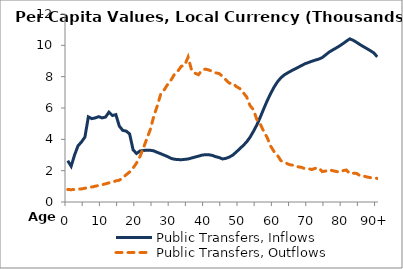
| Category | Public Transfers, Inflows | Public Transfers, Outflows |
|---|---|---|
| 0 | 2636.435 | 796.251 |
|  | 2284.681 | 786.875 |
| 2 | 3008.656 | 799.145 |
| 3 | 3586.263 | 822.263 |
| 4 | 3832.16 | 836.266 |
| 5 | 4143.396 | 877.52 |
| 6 | 5435.272 | 923.747 |
| 7 | 5319.675 | 956.469 |
| 8 | 5367.336 | 1007.529 |
| 9 | 5446.616 | 1054.771 |
| 10 | 5368.425 | 1102.992 |
| 11 | 5422.784 | 1159.778 |
| 12 | 5736.577 | 1221.999 |
| 13 | 5517.777 | 1247.824 |
| 14 | 5577.428 | 1351.046 |
| 15 | 4842.377 | 1390.139 |
| 16 | 4571.552 | 1540.392 |
| 17 | 4525.901 | 1742.083 |
| 18 | 4343.983 | 1917.561 |
| 19 | 3334.344 | 2163.416 |
| 20 | 3094.694 | 2484.869 |
| 21 | 3255.503 | 2902.279 |
| 22 | 3287.121 | 3438.508 |
| 23 | 3310.447 | 4039.507 |
| 24 | 3301.396 | 4621.226 |
| 25 | 3264.789 | 5449.483 |
| 26 | 3169.648 | 6109.37 |
| 27 | 3086.85 | 6857.86 |
| 28 | 2992.792 | 7142.355 |
| 29 | 2904.205 | 7487.77 |
| 30 | 2787.278 | 7776.812 |
| 31 | 2729.9 | 8141.392 |
| 32 | 2709.501 | 8349.759 |
| 33 | 2696.916 | 8658.719 |
| 34 | 2721.718 | 8721.332 |
| 35 | 2744.48 | 9250.804 |
| 36 | 2808.322 | 8428.557 |
| 37 | 2867.524 | 8222.343 |
| 38 | 2924.779 | 8126.729 |
| 39 | 2990.831 | 8403.261 |
| 40 | 3018.134 | 8483.289 |
| 41 | 3015.707 | 8429.567 |
| 42 | 2978.705 | 8335.41 |
| 43 | 2893.491 | 8245.374 |
| 44 | 2840.445 | 8200.298 |
| 45 | 2747.044 | 8021.436 |
| 46 | 2785.606 | 7791.646 |
| 47 | 2869.583 | 7582.022 |
| 48 | 2996.125 | 7588.489 |
| 49 | 3189.312 | 7369.102 |
| 50 | 3393.825 | 7249.431 |
| 51 | 3602.716 | 6987.068 |
| 52 | 3830.332 | 6716.766 |
| 53 | 4131.761 | 6155.45 |
| 54 | 4509.342 | 5885.76 |
| 55 | 4927.816 | 5254.392 |
| 56 | 5423.126 | 4972.79 |
| 57 | 5954.602 | 4489.583 |
| 58 | 6465.635 | 4109.872 |
| 59 | 6923.367 | 3567.87 |
| 60 | 7334.768 | 3216.396 |
| 61 | 7677.775 | 2970.289 |
| 62 | 7935.885 | 2633.972 |
| 63 | 8116.575 | 2551.032 |
| 64 | 8249.88 | 2424.802 |
| 65 | 8370.73 | 2356.759 |
| 66 | 8486.036 | 2347.065 |
| 67 | 8596.942 | 2243.903 |
| 68 | 8711.918 | 2211.836 |
| 69 | 8827.351 | 2121.829 |
| 70 | 8903.279 | 2121.185 |
| 71 | 8986.92 | 2073.385 |
| 72 | 9058.53 | 2151.888 |
| 73 | 9121.804 | 2171.777 |
| 74 | 9219.699 | 1938.843 |
| 75 | 9394.264 | 1975.784 |
| 76 | 9565.717 | 2056.457 |
| 77 | 9701.896 | 2001.58 |
| 78 | 9823.812 | 1950.571 |
| 79 | 9956.132 | 1910.585 |
| 80 | 10103.997 | 1997.547 |
| 81 | 10262.943 | 2044.64 |
| 82 | 10413.981 | 1818.436 |
| 83 | 10321.963 | 1836.528 |
| 84 | 10189.526 | 1823.729 |
| 85 | 10044.531 | 1670.225 |
| 86 | 9914.668 | 1657.202 |
| 87 | 9787.775 | 1597.515 |
| 88 | 9656.155 | 1554.754 |
| 89 | 9516.146 | 1555.731 |
| 90+ | 9262.583 | 1504.203 |